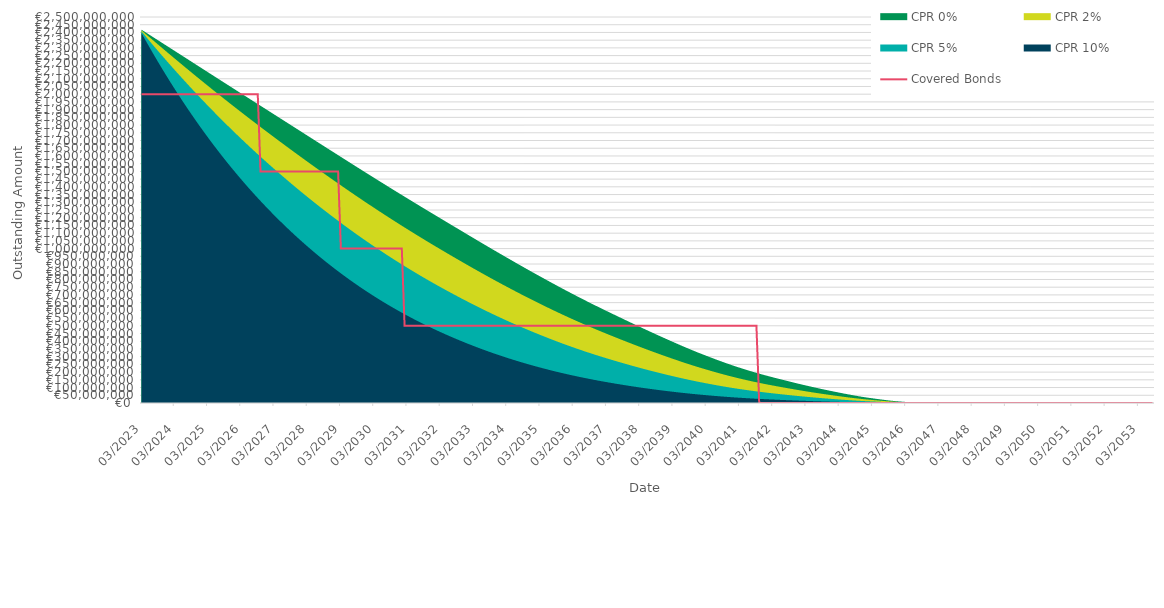
| Category | Covered Bonds |
|---|---|
| 2023-03-31 | 2000000000 |
| 2023-04-30 | 2000000000 |
| 2023-05-31 | 2000000000 |
| 2023-06-30 | 2000000000 |
| 2023-07-31 | 2000000000 |
| 2023-08-31 | 2000000000 |
| 2023-09-30 | 2000000000 |
| 2023-10-31 | 2000000000 |
| 2023-11-30 | 2000000000 |
| 2023-12-31 | 2000000000 |
| 2024-01-31 | 2000000000 |
| 2024-02-29 | 2000000000 |
| 2024-03-31 | 2000000000 |
| 2024-04-30 | 2000000000 |
| 2024-05-31 | 2000000000 |
| 2024-06-30 | 2000000000 |
| 2024-07-31 | 2000000000 |
| 2024-08-31 | 2000000000 |
| 2024-09-30 | 2000000000 |
| 2024-10-31 | 2000000000 |
| 2024-11-30 | 2000000000 |
| 2024-12-31 | 2000000000 |
| 2025-01-31 | 2000000000 |
| 2025-02-28 | 2000000000 |
| 2025-03-31 | 2000000000 |
| 2025-04-30 | 2000000000 |
| 2025-05-31 | 2000000000 |
| 2025-06-30 | 2000000000 |
| 2025-07-31 | 2000000000 |
| 2025-08-31 | 2000000000 |
| 2025-09-30 | 2000000000 |
| 2025-10-31 | 2000000000 |
| 2025-11-30 | 2000000000 |
| 2025-12-31 | 2000000000 |
| 2026-01-31 | 2000000000 |
| 2026-02-28 | 2000000000 |
| 2026-03-31 | 2000000000 |
| 2026-04-30 | 2000000000 |
| 2026-05-31 | 2000000000 |
| 2026-06-30 | 2000000000 |
| 2026-07-31 | 2000000000 |
| 2026-08-31 | 2000000000 |
| 2026-09-30 | 2000000000 |
| 2026-10-31 | 1500000000 |
| 2026-11-30 | 1500000000 |
| 2026-12-31 | 1500000000 |
| 2027-01-31 | 1500000000 |
| 2027-02-28 | 1500000000 |
| 2027-03-31 | 1500000000 |
| 2027-04-30 | 1500000000 |
| 2027-05-31 | 1500000000 |
| 2027-06-30 | 1500000000 |
| 2027-07-31 | 1500000000 |
| 2027-08-31 | 1500000000 |
| 2027-09-30 | 1500000000 |
| 2027-10-31 | 1500000000 |
| 2027-11-30 | 1500000000 |
| 2027-12-31 | 1500000000 |
| 2028-01-31 | 1500000000 |
| 2028-02-29 | 1500000000 |
| 2028-03-31 | 1500000000 |
| 2028-04-30 | 1500000000 |
| 2028-05-31 | 1500000000 |
| 2028-06-30 | 1500000000 |
| 2028-07-31 | 1500000000 |
| 2028-08-31 | 1500000000 |
| 2028-09-30 | 1500000000 |
| 2028-10-31 | 1500000000 |
| 2028-11-30 | 1500000000 |
| 2028-12-31 | 1500000000 |
| 2029-01-31 | 1500000000 |
| 2029-02-28 | 1500000000 |
| 2029-03-31 | 1000000000 |
| 2029-04-30 | 1000000000 |
| 2029-05-31 | 1000000000 |
| 2029-06-30 | 1000000000 |
| 2029-07-31 | 1000000000 |
| 2029-08-31 | 1000000000 |
| 2029-09-30 | 1000000000 |
| 2029-10-31 | 1000000000 |
| 2029-11-30 | 1000000000 |
| 2029-12-31 | 1000000000 |
| 2030-01-31 | 1000000000 |
| 2030-02-28 | 1000000000 |
| 2030-03-31 | 1000000000 |
| 2030-04-30 | 1000000000 |
| 2030-05-31 | 1000000000 |
| 2030-06-30 | 1000000000 |
| 2030-07-31 | 1000000000 |
| 2030-08-31 | 1000000000 |
| 2030-09-30 | 1000000000 |
| 2030-10-31 | 1000000000 |
| 2030-11-30 | 1000000000 |
| 2030-12-31 | 1000000000 |
| 2031-01-31 | 1000000000 |
| 2031-02-28 | 500000000 |
| 2031-03-31 | 500000000 |
| 2031-04-30 | 500000000 |
| 2031-05-31 | 500000000 |
| 2031-06-30 | 500000000 |
| 2031-07-31 | 500000000 |
| 2031-08-31 | 500000000 |
| 2031-09-30 | 500000000 |
| 2031-10-31 | 500000000 |
| 2031-11-30 | 500000000 |
| 2031-12-31 | 500000000 |
| 2032-01-31 | 500000000 |
| 2032-02-29 | 500000000 |
| 2032-03-31 | 500000000 |
| 2032-04-30 | 500000000 |
| 2032-05-31 | 500000000 |
| 2032-06-30 | 500000000 |
| 2032-07-31 | 500000000 |
| 2032-08-31 | 500000000 |
| 2032-09-30 | 500000000 |
| 2032-10-31 | 500000000 |
| 2032-11-30 | 500000000 |
| 2032-12-31 | 500000000 |
| 2033-01-31 | 500000000 |
| 2033-02-28 | 500000000 |
| 2033-03-31 | 500000000 |
| 2033-04-30 | 500000000 |
| 2033-05-31 | 500000000 |
| 2033-06-30 | 500000000 |
| 2033-07-31 | 500000000 |
| 2033-08-31 | 500000000 |
| 2033-09-30 | 500000000 |
| 2033-10-31 | 500000000 |
| 2033-11-30 | 500000000 |
| 2033-12-31 | 500000000 |
| 2034-01-31 | 500000000 |
| 2034-02-28 | 500000000 |
| 2034-03-31 | 500000000 |
| 2034-04-30 | 500000000 |
| 2034-05-31 | 500000000 |
| 2034-06-30 | 500000000 |
| 2034-07-31 | 500000000 |
| 2034-08-31 | 500000000 |
| 2034-09-30 | 500000000 |
| 2034-10-31 | 500000000 |
| 2034-11-30 | 500000000 |
| 2034-12-31 | 500000000 |
| 2035-01-31 | 500000000 |
| 2035-02-28 | 500000000 |
| 2035-03-31 | 500000000 |
| 2035-04-30 | 500000000 |
| 2035-05-31 | 500000000 |
| 2035-06-30 | 500000000 |
| 2035-07-31 | 500000000 |
| 2035-08-31 | 500000000 |
| 2035-09-30 | 500000000 |
| 2035-10-31 | 500000000 |
| 2035-11-30 | 500000000 |
| 2035-12-31 | 500000000 |
| 2036-01-31 | 500000000 |
| 2036-02-29 | 500000000 |
| 2036-03-31 | 500000000 |
| 2036-04-30 | 500000000 |
| 2036-05-31 | 500000000 |
| 2036-06-30 | 500000000 |
| 2036-07-31 | 500000000 |
| 2036-08-31 | 500000000 |
| 2036-09-30 | 500000000 |
| 2036-10-31 | 500000000 |
| 2036-11-30 | 500000000 |
| 2036-12-31 | 500000000 |
| 2037-01-31 | 500000000 |
| 2037-02-28 | 500000000 |
| 2037-03-31 | 500000000 |
| 2037-04-30 | 500000000 |
| 2037-05-31 | 500000000 |
| 2037-06-30 | 500000000 |
| 2037-07-31 | 500000000 |
| 2037-08-31 | 500000000 |
| 2037-09-30 | 500000000 |
| 2037-10-31 | 500000000 |
| 2037-11-30 | 500000000 |
| 2037-12-31 | 500000000 |
| 2038-01-31 | 500000000 |
| 2038-02-28 | 500000000 |
| 2038-03-31 | 500000000 |
| 2038-04-30 | 500000000 |
| 2038-05-31 | 500000000 |
| 2038-06-30 | 500000000 |
| 2038-07-31 | 500000000 |
| 2038-08-31 | 500000000 |
| 2038-09-30 | 500000000 |
| 2038-10-31 | 500000000 |
| 2038-11-30 | 500000000 |
| 2038-12-31 | 500000000 |
| 2039-01-31 | 500000000 |
| 2039-02-28 | 500000000 |
| 2039-03-31 | 500000000 |
| 2039-04-30 | 500000000 |
| 2039-05-31 | 500000000 |
| 2039-06-30 | 500000000 |
| 2039-07-31 | 500000000 |
| 2039-08-31 | 500000000 |
| 2039-09-30 | 500000000 |
| 2039-10-31 | 500000000 |
| 2039-11-30 | 500000000 |
| 2039-12-31 | 500000000 |
| 2040-01-31 | 500000000 |
| 2040-02-29 | 500000000 |
| 2040-03-31 | 500000000 |
| 2040-04-30 | 500000000 |
| 2040-05-31 | 500000000 |
| 2040-06-30 | 500000000 |
| 2040-07-31 | 500000000 |
| 2040-08-31 | 500000000 |
| 2040-09-30 | 500000000 |
| 2040-10-31 | 500000000 |
| 2040-11-30 | 500000000 |
| 2040-12-31 | 500000000 |
| 2041-01-31 | 500000000 |
| 2041-02-28 | 500000000 |
| 2041-03-31 | 500000000 |
| 2041-04-30 | 500000000 |
| 2041-05-31 | 500000000 |
| 2041-06-30 | 500000000 |
| 2041-07-31 | 500000000 |
| 2041-08-31 | 500000000 |
| 2041-09-30 | 500000000 |
| 2041-10-31 | 0 |
| 2041-11-30 | 0 |
| 2041-12-31 | 0 |
| 2042-01-31 | 0 |
| 2042-02-28 | 0 |
| 2042-03-31 | 0 |
| 2042-04-30 | 0 |
| 2042-05-31 | 0 |
| 2042-06-30 | 0 |
| 2042-07-31 | 0 |
| 2042-08-31 | 0 |
| 2042-09-30 | 0 |
| 2042-10-31 | 0 |
| 2042-11-30 | 0 |
| 2042-12-31 | 0 |
| 2043-01-31 | 0 |
| 2043-02-28 | 0 |
| 2043-03-31 | 0 |
| 2043-04-30 | 0 |
| 2043-05-31 | 0 |
| 2043-06-30 | 0 |
| 2043-07-31 | 0 |
| 2043-08-31 | 0 |
| 2043-09-30 | 0 |
| 2043-10-31 | 0 |
| 2043-11-30 | 0 |
| 2043-12-31 | 0 |
| 2044-01-31 | 0 |
| 2044-02-29 | 0 |
| 2044-03-31 | 0 |
| 2044-04-30 | 0 |
| 2044-05-31 | 0 |
| 2044-06-30 | 0 |
| 2044-07-31 | 0 |
| 2044-08-31 | 0 |
| 2044-09-30 | 0 |
| 2044-10-31 | 0 |
| 2044-11-30 | 0 |
| 2044-12-31 | 0 |
| 2045-01-31 | 0 |
| 2045-02-28 | 0 |
| 2045-03-31 | 0 |
| 2045-04-30 | 0 |
| 2045-05-31 | 0 |
| 2045-06-30 | 0 |
| 2045-07-31 | 0 |
| 2045-08-31 | 0 |
| 2045-09-30 | 0 |
| 2045-10-31 | 0 |
| 2045-11-30 | 0 |
| 2045-12-31 | 0 |
| 2046-01-31 | 0 |
| 2046-02-28 | 0 |
| 2046-03-31 | 0 |
| 2046-04-30 | 0 |
| 2046-05-31 | 0 |
| 2046-06-30 | 0 |
| 2046-07-31 | 0 |
| 2046-08-31 | 0 |
| 2046-09-30 | 0 |
| 2046-10-31 | 0 |
| 2046-11-30 | 0 |
| 2046-12-31 | 0 |
| 2047-01-31 | 0 |
| 2047-02-28 | 0 |
| 2047-03-31 | 0 |
| 2047-04-30 | 0 |
| 2047-05-31 | 0 |
| 2047-06-30 | 0 |
| 2047-07-31 | 0 |
| 2047-08-31 | 0 |
| 2047-09-30 | 0 |
| 2047-10-31 | 0 |
| 2047-11-30 | 0 |
| 2047-12-31 | 0 |
| 2048-01-31 | 0 |
| 2048-02-29 | 0 |
| 2048-03-31 | 0 |
| 2048-04-30 | 0 |
| 2048-05-31 | 0 |
| 2048-06-30 | 0 |
| 2048-07-31 | 0 |
| 2048-08-31 | 0 |
| 2048-09-30 | 0 |
| 2048-10-31 | 0 |
| 2048-11-30 | 0 |
| 2048-12-31 | 0 |
| 2049-01-31 | 0 |
| 2049-02-28 | 0 |
| 2049-03-31 | 0 |
| 2049-04-30 | 0 |
| 2049-05-31 | 0 |
| 2049-06-30 | 0 |
| 2049-07-31 | 0 |
| 2049-08-31 | 0 |
| 2049-09-30 | 0 |
| 2049-10-31 | 0 |
| 2049-11-30 | 0 |
| 2049-12-31 | 0 |
| 2050-01-31 | 0 |
| 2050-02-28 | 0 |
| 2050-03-31 | 0 |
| 2050-04-30 | 0 |
| 2050-05-31 | 0 |
| 2050-06-30 | 0 |
| 2050-07-31 | 0 |
| 2050-08-31 | 0 |
| 2050-09-30 | 0 |
| 2050-10-31 | 0 |
| 2050-11-30 | 0 |
| 2050-12-31 | 0 |
| 2051-01-31 | 0 |
| 2051-02-28 | 0 |
| 2051-03-31 | 0 |
| 2051-04-30 | 0 |
| 2051-05-31 | 0 |
| 2051-06-30 | 0 |
| 2051-07-31 | 0 |
| 2051-08-31 | 0 |
| 2051-09-30 | 0 |
| 2051-10-31 | 0 |
| 2051-11-30 | 0 |
| 2051-12-31 | 0 |
| 2052-01-31 | 0 |
| 2052-02-29 | 0 |
| 2052-03-31 | 0 |
| 2052-04-30 | 0 |
| 2052-05-31 | 0 |
| 2052-06-30 | 0 |
| 2052-07-31 | 0 |
| 2052-08-31 | 0 |
| 2052-09-30 | 0 |
| 2052-10-31 | 0 |
| 2052-11-30 | 0 |
| 2052-12-31 | 0 |
| 2053-01-31 | 0 |
| 2053-02-28 | 0 |
| 2053-03-31 | 0 |
| 2053-04-30 | 0 |
| 2053-05-31 | 0 |
| 2053-06-30 | 0 |
| 2053-07-31 | 0 |
| 2053-08-31 | 0 |